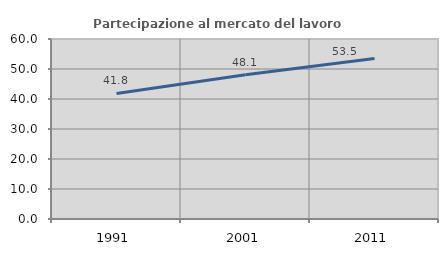
| Category | Partecipazione al mercato del lavoro  femminile |
|---|---|
| 1991.0 | 41.838 |
| 2001.0 | 48.111 |
| 2011.0 | 53.531 |